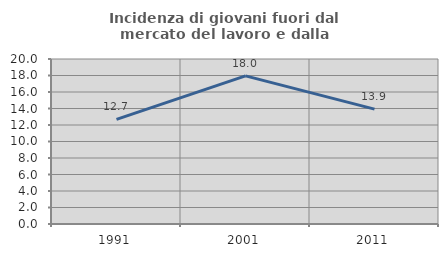
| Category | Incidenza di giovani fuori dal mercato del lavoro e dalla formazione  |
|---|---|
| 1991.0 | 12.673 |
| 2001.0 | 17.959 |
| 2011.0 | 13.929 |